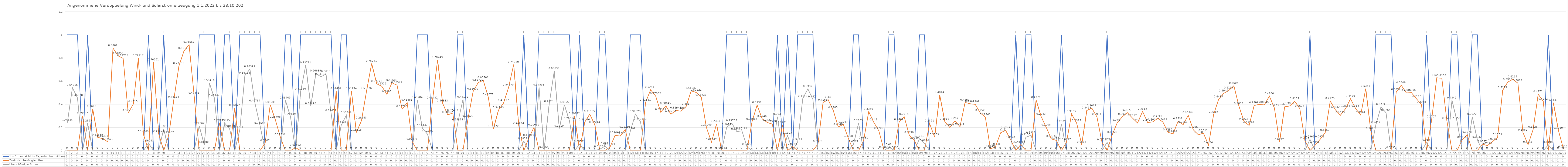
| Category | 1 = Strom reicht im Tagesdurchschnitt aus | Zusätzlich benötigter Strom | Überschüssiger Strom |
|---|---|---|---|
| 0 | 1 | 0 | 0.241 |
| 1 | 1 | 0 | 0.543 |
| 2 | 1 | 0 | 0.455 |
| 3 | 0 | 0.3 | 0 |
| 4 | 1 | 0 | 0.236 |
| 5 | 0 | 0.361 | 0 |
| 6 | 0 | 0.114 | 0 |
| 7 | 0 | 0.103 | 0 |
| 8 | 0 | 0.075 | 0 |
| 9 | 0 | 0.886 | 0 |
| 10 | 0 | 0.819 | 0 |
| 11 | 0 | 0.797 | 0 |
| 12 | 0 | 0.325 | 0 |
| 13 | 0 | 0.402 | 0 |
| 14 | 0 | 0.799 | 0 |
| 15 | 0 | 0.141 | 0 |
| 16 | 1 | 0 | 0.063 |
| 17 | 0 | 0.763 | 0 |
| 18 | 0 | 0.146 | 0 |
| 19 | 1 | 0 | 0.188 |
| 20 | 0 | 0.135 | 0 |
| 21 | 0 | 0.442 | 0 |
| 22 | 0 | 0.732 | 0 |
| 23 | 0 | 0.861 | 0 |
| 24 | 0 | 0.916 | 0 |
| 25 | 0 | 0.475 | 0 |
| 26 | 1 | 0 | 0.213 |
| 27 | 1 | 0 | 0.049 |
| 28 | 1 | 0 | 0.584 |
| 29 | 1 | 0 | 0.452 |
| 30 | 0 | 0.238 | 0 |
| 31 | 1 | 0 | 0.239 |
| 32 | 1 | 0 | 0.187 |
| 33 | 0 | 0.369 | 0 |
| 34 | 1 | 0 | 0.179 |
| 35 | 1 | 0 | 0.648 |
| 36 | 1 | 0 | 0.704 |
| 37 | 1 | 0 | 0.407 |
| 38 | 1 | 0 | 0.216 |
| 39 | 0 | 0.065 | 0 |
| 40 | 0 | 0.395 | 0 |
| 41 | 0 | 0.268 | 0 |
| 42 | 0 | 0.115 | 0 |
| 43 | 1 | 0 | 0.434 |
| 44 | 1 | 0 | 0.291 |
| 45 | 0 | 0.026 | 0 |
| 46 | 1 | 0 | 0.512 |
| 47 | 1 | 0 | 0.737 |
| 48 | 1 | 0 | 0.385 |
| 49 | 1 | 0 | 0.667 |
| 50 | 1 | 0 | 0.637 |
| 51 | 1 | 0 | 0.661 |
| 52 | 1 | 0 | 0.324 |
| 53 | 0 | 0.515 | 0 |
| 54 | 1 | 0 | 0.219 |
| 55 | 1 | 0 | 0.306 |
| 56 | 0 | 0.515 | 0 |
| 57 | 0 | 0.156 | 0 |
| 58 | 0 | 0.261 | 0 |
| 59 | 0 | 0.517 | 0 |
| 60 | 0 | 0.752 | 0 |
| 61 | 0 | 0.578 | 0 |
| 62 | 0 | 0.556 | 0 |
| 63 | 0 | 0.487 | 0 |
| 64 | 0 | 0.586 | 0 |
| 65 | 0 | 0.565 | 0 |
| 66 | 0 | 0.358 | 0 |
| 67 | 0 | 0.415 | 0 |
| 68 | 0 | 0.077 | 0 |
| 69 | 1 | 0 | 0.438 |
| 70 | 1 | 0 | 0.193 |
| 71 | 1 | 0 | 0.143 |
| 72 | 0 | 0.434 | 0 |
| 73 | 0 | 0.782 | 0 |
| 74 | 0 | 0.408 | 0 |
| 75 | 0 | 0.309 | 0 |
| 76 | 0 | 0.325 | 0 |
| 77 | 1 | 0 | 0.245 |
| 78 | 1 | 0 | 0.441 |
| 79 | 0 | 0.276 | 0 |
| 80 | 0 | 0.51 | 0 |
| 81 | 0 | 0.587 | 0 |
| 82 | 0 | 0.608 | 0 |
| 83 | 0 | 0.461 | 0 |
| 84 | 0 | 0.188 | 0 |
| 85 | 0 | 0.349 | 0 |
| 86 | 0 | 0.411 | 0 |
| 87 | 0 | 0.546 | 0 |
| 88 | 0 | 0.743 | 0 |
| 89 | 0 | 0.217 | 0 |
| 90 | 1 | 0 | 0.081 |
| 91 | 0 | 0.11 | 0 |
| 92 | 0 | 0.2 | 0 |
| 93 | 1 | 0 | 0.546 |
| 94 | 1 | 0 | 0.006 |
| 95 | 1 | 0 | 0.402 |
| 96 | 1 | 0 | 0.686 |
| 97 | 1 | 0 | 0.192 |
| 98 | 1 | 0 | 0.396 |
| 99 | 1 | 0 | 0.256 |
| 100 | 0 | 0.297 | 0 |
| 101 | 1 | 0 | 0.055 |
| 102 | 0 | 0.245 | 0 |
| 103 | 0 | 0.316 | 0 |
| 104 | 0 | 0.222 | 0 |
| 105 | 1 | 0 | 0.013 |
| 106 | 1 | 0 | 0.038 |
| 107 | 0 | 0.031 | 0 |
| 108 | 0 | 0.132 | 0 |
| 109 | 0 | 0.125 | 0 |
| 110 | 0 | 0.181 | 0 |
| 111 | 1 | 0 | 0.168 |
| 112 | 1 | 0 | 0.315 |
| 113 | 1 | 0 | 0.25 |
| 114 | 0 | 0.415 | 0 |
| 115 | 0 | 0.525 | 0 |
| 116 | 0 | 0.471 | 0 |
| 117 | 0 | 0.332 | 0 |
| 118 | 0 | 0.386 | 0 |
| 119 | 0 | 0.314 | 0 |
| 120 | 0 | 0.346 | 0 |
| 121 | 0 | 0.341 | 0 |
| 122 | 0 | 0.381 | 0 |
| 123 | 0 | 0.516 | 0 |
| 124 | 0 | 0.502 | 0 |
| 125 | 0 | 0.459 | 0 |
| 126 | 0 | 0.2 | 0 |
| 127 | 0 | 0.073 | 0 |
| 128 | 0 | 0.231 | 0 |
| 129 | 0 | 0 | 0 |
| 130 | 1 | 0 | 0.202 |
| 131 | 1 | 0 | 0.237 |
| 132 | 1 | 0 | 0.164 |
| 133 | 1 | 0 | 0.171 |
| 134 | 1 | 0 | 0.033 |
| 135 | 0 | 0.251 | 0 |
| 136 | 0 | 0.394 | 0 |
| 137 | 0 | 0.275 | 0 |
| 138 | 0 | 0.243 | 0 |
| 139 | 0 | 0.229 | 0 |
| 140 | 1 | 0 | 0.293 |
| 141 | 0 | 0.22 | 0 |
| 142 | 1 | 0 | 0.13 |
| 143 | 0 | 0.035 | 0 |
| 144 | 1 | 0 | 0.076 |
| 145 | 1 | 0 | 0.449 |
| 146 | 1 | 0 | 0.533 |
| 147 | 1 | 0 | 0.442 |
| 148 | 0 | 0.057 | 0 |
| 149 | 0 | 0.416 | 0 |
| 150 | 0 | 0.44 | 0 |
| 151 | 0 | 0.348 | 0 |
| 152 | 0 | 0.205 | 0 |
| 153 | 0 | 0.227 | 0 |
| 154 | 0 | 0.104 | 0 |
| 155 | 1 | 0 | 0.054 |
| 156 | 1 | 0 | 0.237 |
| 157 | 0 | 0.088 | 0 |
| 158 | 0 | 0.337 | 0 |
| 159 | 0 | 0.245 | 0 |
| 160 | 0 | 0.171 | 0 |
| 161 | 0 | 0.007 | 0 |
| 162 | 1 | 0 | 0.03 |
| 163 | 1 | 0 | 0.004 |
| 164 | 0 | 0.247 | 0 |
| 165 | 0 | 0.292 | 0 |
| 166 | 0 | 0.134 | 0 |
| 167 | 0 | 0.087 | 0 |
| 168 | 1 | 0 | 0.102 |
| 169 | 1 | 0 | 0.064 |
| 170 | 0 | 0.235 | 0 |
| 171 | 0 | 0.116 | 0 |
| 172 | 0 | 0.481 | 0 |
| 173 | 0 | 0.252 | 0 |
| 174 | 0 | 0.2 | 0 |
| 175 | 0 | 0.257 | 0 |
| 176 | 0 | 0.208 | 0 |
| 177 | 0 | 0.416 | 0 |
| 178 | 0 | 0.405 | 0 |
| 179 | 0 | 0.4 | 0 |
| 180 | 0 | 0.325 | 0 |
| 181 | 0 | 0.289 | 0 |
| 182 | 0 | 0.015 | 0 |
| 183 | 0 | 0.034 | 0 |
| 184 | 0 | 0.154 | 0 |
| 185 | 0 | 0.175 | 0 |
| 186 | 0 | 0.093 | 0 |
| 187 | 1 | 0 | 0.046 |
| 188 | 0 | 0.053 | 0 |
| 189 | 1 | 0 | 0.115 |
| 190 | 1 | 0 | 0.133 |
| 191 | 0 | 0.438 | 0 |
| 192 | 0 | 0.294 | 0 |
| 193 | 0 | 0.201 | 0 |
| 194 | 0 | 0.102 | 0 |
| 195 | 0 | 0.088 | 0 |
| 196 | 1 | 0 | 0.23 |
| 197 | 0 | 0.073 | 0 |
| 198 | 0 | 0.316 | 0 |
| 199 | 0 | 0.238 | 0 |
| 200 | 0 | 0.051 | 0 |
| 201 | 0 | 0.347 | 0 |
| 202 | 0 | 0.366 | 0 |
| 203 | 0 | 0.291 | 0 |
| 204 | 0 | 0.071 | 0 |
| 205 | 1 | 0 | 0.071 |
| 206 | 0 | 0.135 | 0 |
| 207 | 0 | 0.24 | 0 |
| 208 | 0 | 0.292 | 0 |
| 209 | 0 | 0.328 | 0 |
| 210 | 0 | 0.282 | 0 |
| 211 | 0 | 0.239 | 0 |
| 212 | 0 | 0.338 | 0 |
| 213 | 0 | 0.243 | 0 |
| 214 | 0 | 0.248 | 0 |
| 215 | 0 | 0.278 | 0 |
| 216 | 0 | 0.247 | 0 |
| 217 | 0 | 0.159 | 0 |
| 218 | 0 | 0.144 | 0 |
| 219 | 0 | 0.253 | 0 |
| 220 | 0 | 0.225 | 0 |
| 221 | 0 | 0.305 | 0 |
| 222 | 0 | 0.18 | 0 |
| 223 | 0 | 0.137 | 0 |
| 224 | 0 | 0.151 | 0 |
| 225 | 0 | 0.047 | 0 |
| 226 | 0 | 0.311 | 0 |
| 227 | 0 | 0.444 | 0 |
| 228 | 0 | 0.495 | 0 |
| 229 | 0 | 0.52 | 0 |
| 230 | 0 | 0.56 | 0 |
| 231 | 0 | 0.383 | 0 |
| 232 | 0 | 0.252 | 0 |
| 233 | 0 | 0.218 | 0 |
| 234 | 0 | 0.391 | 0 |
| 235 | 0 | 0.399 | 0 |
| 236 | 0 | 0.394 | 0 |
| 237 | 0 | 0.471 | 0 |
| 238 | 0 | 0.366 | 0 |
| 239 | 0 | 0.073 | 0 |
| 240 | 0 | 0.378 | 0 |
| 241 | 0 | 0.386 | 0 |
| 242 | 0 | 0.426 | 0 |
| 243 | 0 | 0.363 | 0 |
| 244 | 0 | 0.088 | 0 |
| 245 | 1 | 0 | 0.097 |
| 246 | 0 | 0.046 | 0 |
| 247 | 0 | 0.097 | 0 |
| 248 | 0 | 0.155 | 0 |
| 249 | 0 | 0.428 | 0 |
| 250 | 0 | 0.353 | 0 |
| 251 | 0 | 0.305 | 0 |
| 252 | 0 | 0.361 | 0 |
| 253 | 0 | 0.448 | 0 |
| 254 | 0 | 0.363 | 0 |
| 255 | 0 | 0.307 | 0 |
| 256 | 0 | 0.535 | 0 |
| 257 | 0 | 0.169 | 0 |
| 258 | 1 | 0 | 0.225 |
| 259 | 1 | 0 | 0.377 |
| 260 | 1 | 0 | 0.326 |
| 261 | 1 | 0 | 0.003 |
| 262 | 0 | 0.505 | 0 |
| 263 | 0 | 0.565 | 0 |
| 264 | 0 | 0.499 | 0 |
| 265 | 0 | 0.5 | 0 |
| 266 | 0 | 0.448 | 0 |
| 267 | 0 | 0.397 | 0 |
| 268 | 1 | 0 | 0.069 |
| 269 | 0 | 0.271 | 0 |
| 270 | 0 | 0.629 | 0 |
| 271 | 0 | 0.626 | 0 |
| 272 | 0 | 0.257 | 0 |
| 273 | 1 | 0 | 0.434 |
| 274 | 1 | 0 | 0.254 |
| 275 | 0 | 0.092 | 0 |
| 276 | 0 | 0.138 | 0 |
| 277 | 1 | 0 | 0.292 |
| 278 | 1 | 0 | 0.094 |
| 279 | 0 | 0.056 | 0 |
| 280 | 0 | 0.043 | 0 |
| 281 | 0 | 0.077 | 0 |
| 282 | 0 | 0.115 | 0 |
| 283 | 0 | 0.521 | 0 |
| 284 | 0 | 0.592 | 0 |
| 285 | 0 | 0.616 | 0 |
| 286 | 0 | 0.582 | 0 |
| 287 | 0 | 0.156 | 0 |
| 288 | 0 | 0.051 | 0 |
| 289 | 0 | 0.183 | 0 |
| 290 | 0 | 0.487 | 0 |
| 291 | 0 | 0.425 | 0 |
| 292 | 1 | 0 | 0.05 |
| 293 | 0 | 0.414 | 0 |
| 294 | 0 | 0.172 | 0 |
| 295 | 0 | 0.011 | 0 |